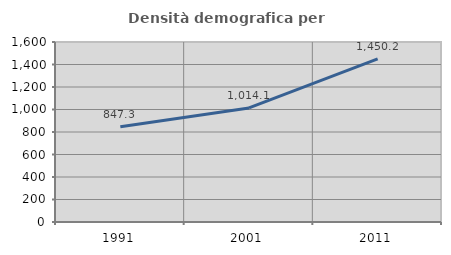
| Category | Densità demografica |
|---|---|
| 1991.0 | 847.342 |
| 2001.0 | 1014.144 |
| 2011.0 | 1450.171 |